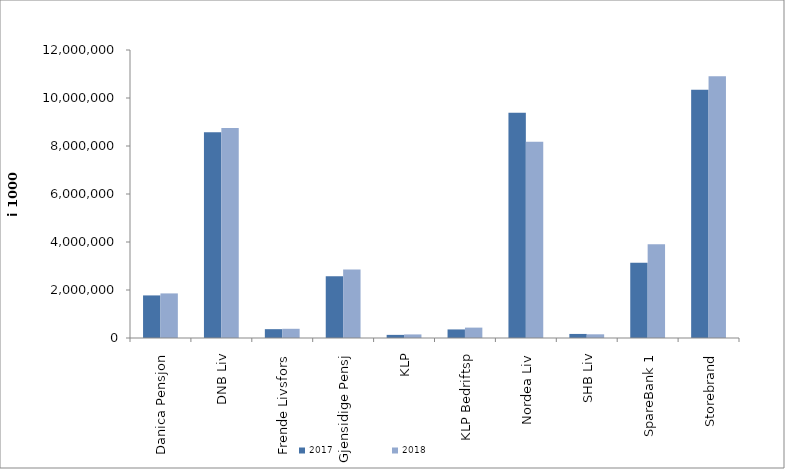
| Category | 2017 | 2018 |
|---|---|---|
| Danica Pensjon | 1774297.267 | 1858117.182 |
| DNB Liv | 8571932 | 8751380.894 |
| Frende Livsfors | 368028 | 383502.5 |
| Gjensidige Pensj | 2571137 | 2849928 |
| KLP | 130226.346 | 148957.792 |
| KLP Bedriftsp | 356633 | 432767 |
| Nordea Liv | 9386463.933 | 8182157.738 |
| SHB Liv | 169062.92 | 153887 |
| SpareBank 1 | 3137901.488 | 3902966.411 |
| Storebrand | 10339332.777 | 10907068.207 |